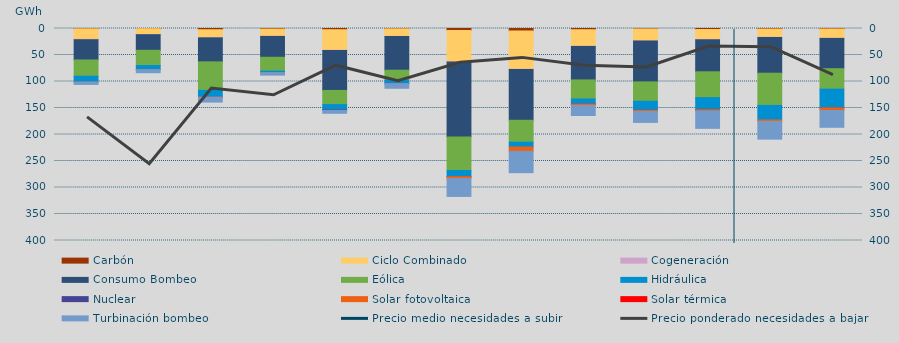
| Category | Carbón | Ciclo Combinado | Cogeneración | Consumo Bombeo | Eólica | Hidráulica | Nuclear | Solar fotovoltaica | Solar térmica | Turbinación bombeo |
|---|---|---|---|---|---|---|---|---|---|---|
| 0 | 587 | 19880.3 | 745.7 | 38129.4 | 30707.4 | 11038.8 | 0 | 83.9 | 0 | 4346.7 |
| 1 | 318.1 | 10959 | 432 | 29416 | 28648.7 | 7863.5 | 0 | 105 | 0 | 5723.9 |
| 2 | 2349.7 | 14809.8 | 513.2 | 45318.9 | 53811.9 | 12435.2 | 162.7 | 147 | 0 | 9302.2 |
| 3 | 1032.05 | 13586.525 | 372.15 | 39287.3 | 26177.05 | 2674.925 | 0 | 91.5 | 0 | 4779.4 |
| 4 | 2338.05 | 38734.9 | 425.275 | 75366.15 | 26713.775 | 10087.325 | 758.925 | 314.05 | 0 | 5208.05 |
| 5 | 607 | 14346.825 | 84.1 | 63631.75 | 18608.375 | 6324.8 | 376.5 | 124.625 | 0 | 8670.125 |
| 6 | 3747 | 59427.025 | 92.6 | 141431.55 | 63317 | 11208.6 | 225.6 | 3390.725 | 0 | 34005.35 |
| 7 | 4777.9 | 72027.575 | 369 | 96009.825 | 41297.175 | 9161.725 | 0 | 8173.5 | 0 | 40164.95 |
| 8 | 2339.95 | 31212.45 | 309 | 63146.125 | 35992.6 | 9536.075 | 20 | 2519.6 | 0 | 19037.975 |
| 9 | 804 | 22741.325 | 259.55 | 76959.4 | 36430.1 | 16893 | 82 | 2101.325 | 0 | 20947.55 |
| 10 | 1954 | 18792.9 | 569.425 | 60395.65 | 48803.7 | 22168.6 | 540.725 | 2191.975 | 0 | 32969.35 |
| 11 | 1013 | 15498.975 | 284.05 | 67580.25 | 60658.55 | 27501.4 | 0 | 2682.825 | 0 | 33526.625 |
| 12 | 883 | 17650.875 | 181.5 | 57086.475 | 38624.325 | 35109.7 | 186 | 4912.925 | 0 | 31800.3 |